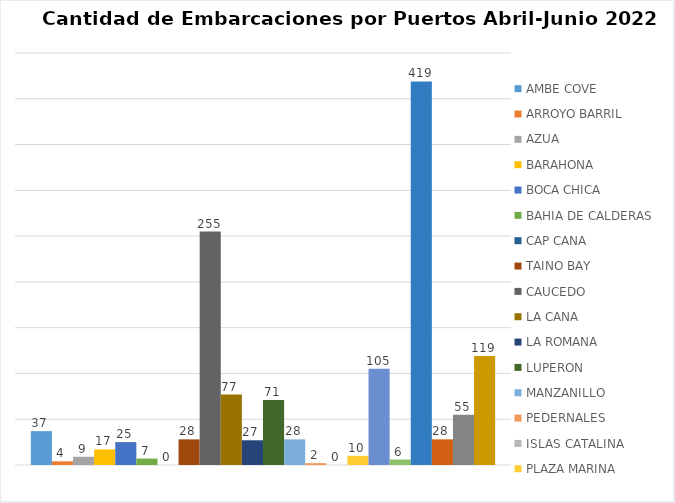
| Category | AMBE COVE | ARROYO BARRIL | AZUA | BARAHONA | BOCA CHICA | BAHIA DE CALDERAS | CAP CANA | TAINO BAY | CAUCEDO | LA CANA | LA ROMANA | LUPERON  | MANZANILLO | PEDERNALES | ISLAS CATALINA | PLAZA MARINA | PUERTO PLATA | PUNTA CATALINA | RIO HAINA | SAN PEDRO DE MACORÍS | SANTA BÁRBARA | SANTO DOMINGO |
|---|---|---|---|---|---|---|---|---|---|---|---|---|---|---|---|---|---|---|---|---|---|---|
| 0 | 37 | 4 | 9 | 17 | 25 | 7 | 0 | 28 | 255 | 77 | 27 | 71 | 28 | 2 | 0 | 10 | 105 | 6 | 419 | 28 | 55 | 119 |